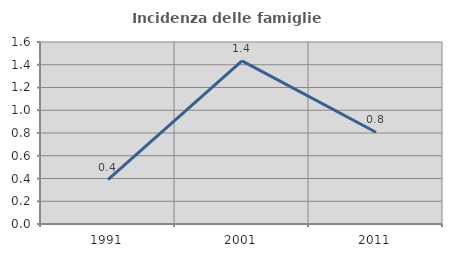
| Category | Incidenza delle famiglie numerose |
|---|---|
| 1991.0 | 0.391 |
| 2001.0 | 1.434 |
| 2011.0 | 0.806 |